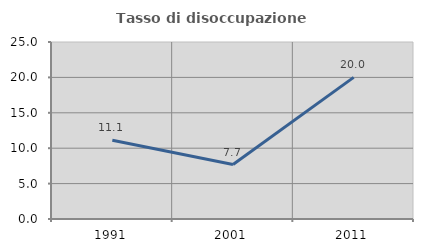
| Category | Tasso di disoccupazione giovanile  |
|---|---|
| 1991.0 | 11.111 |
| 2001.0 | 7.692 |
| 2011.0 | 20 |